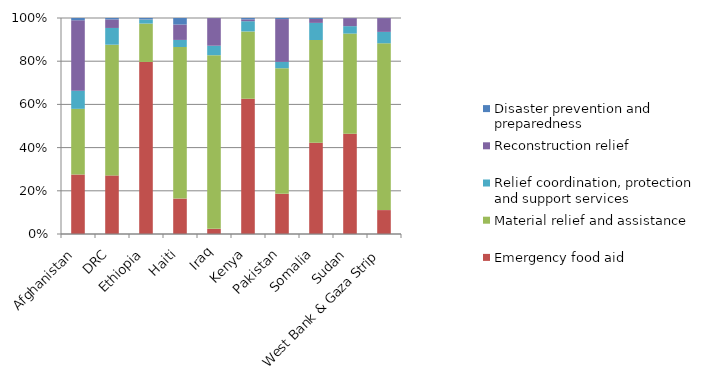
| Category | Emergency food aid | Material relief and assistance  | Relief coordination, protection and support services | Reconstruction relief | Disaster prevention and preparedness |
|---|---|---|---|---|---|
| Afghanistan | 778.161 | 859.941 | 237.999 | 920.792 | 29.762 |
| DRC | 523.693 | 1168.853 | 149.729 | 76.049 | 13.012 |
| Ethiopia | 2164.445 | 482.625 | 51.193 | 2.677 | 16.134 |
| Haiti | 349.108 | 1494.962 | 69.546 | 151.597 | 64.543 |
| Iraq | 38.093 | 1286.563 | 70.159 | 204.707 | 0.648 |
| Kenya | 797.93 | 396.634 | 60.392 | 10.57 | 8.32 |
| Pakistan | 571.145 | 1785.979 | 90.609 | 608.254 | 15.319 |
| Somalia | 766.272 | 863.239 | 143.561 | 33.416 | 7.667 |
| Sudan | 2113.012 | 2108.134 | 156.367 | 168.525 | 3.027 |
| West Bank & Gaza Strip | 192.613 | 1344.582 | 91.818 | 111.073 | 0.868 |